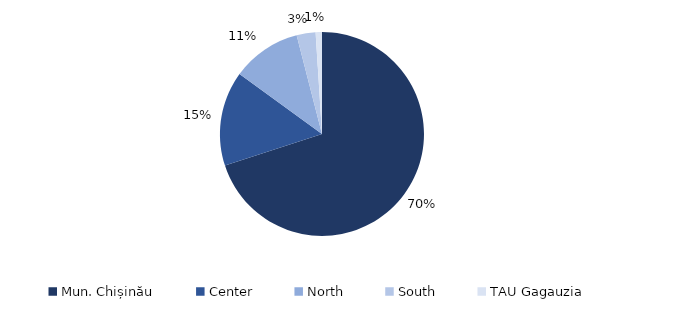
| Category | Series 0 |
|---|---|
| Mun. Chișinău | 0.7 |
| Center | 0.15 |
| North | 0.11 |
| South | 0.03 |
| TAU Gagauzia | 0.01 |